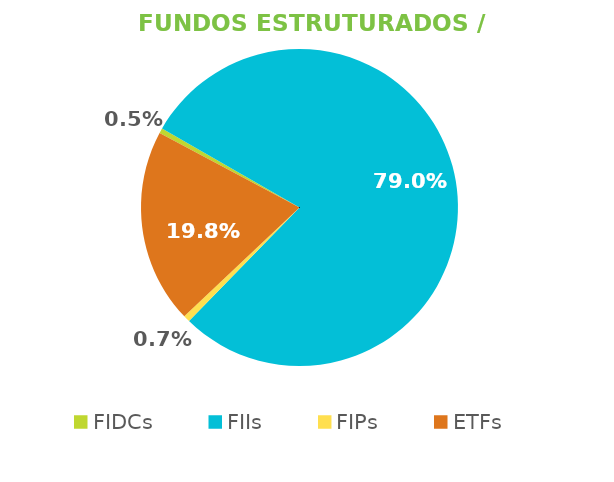
| Category | Fundos Estruturados / ETFs |
|---|---|
| FIDCs | 0.005 |
| FIIs | 0.79 |
| FIPs | 0.007 |
| ETFs | 0.198 |